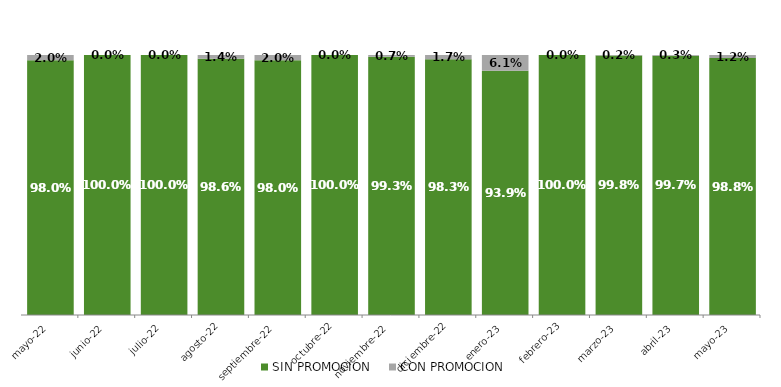
| Category | SIN PROMOCION   | CON PROMOCION   |
|---|---|---|
| 2022-05-01 | 0.98 | 0.02 |
| 2022-06-01 | 1 | 0 |
| 2022-07-01 | 1 | 0 |
| 2022-08-01 | 0.986 | 0.014 |
| 2022-09-01 | 0.98 | 0.02 |
| 2022-10-01 | 1 | 0 |
| 2022-11-01 | 0.993 | 0.007 |
| 2022-12-01 | 0.983 | 0.017 |
| 2023-01-01 | 0.939 | 0.061 |
| 2023-02-01 | 1 | 0 |
| 2023-03-01 | 0.998 | 0.002 |
| 2023-04-01 | 0.997 | 0.003 |
| 2023-05-01 | 0.988 | 0.012 |